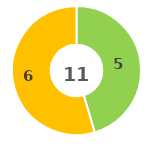
| Category | Series 0 |
|---|---|
| 0 | 0 |
| 1 | 5 |
| 2 | 6 |
| 3 | 0 |
| 4 | 0 |